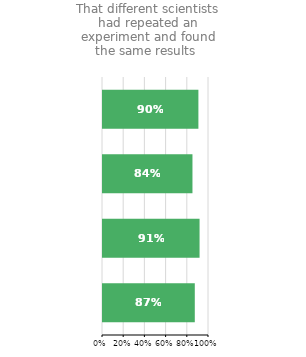
| Category | That different scientists had repeated an experiment and found the same results |
|---|---|
| Turkey | 0.866 |
| Israel | 0.911 |
| USA | 0.844 |
| Europe total | 0.9 |